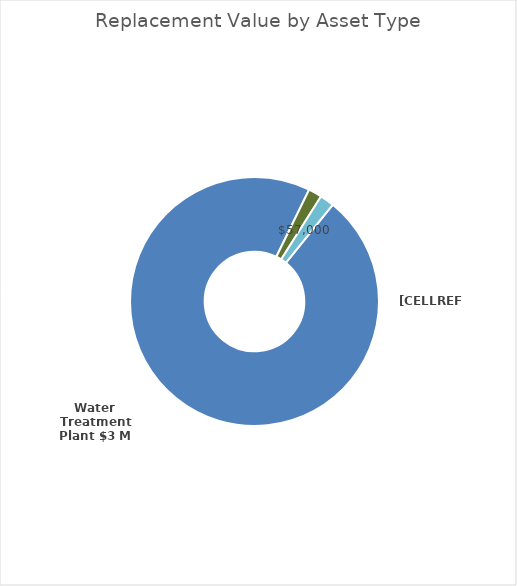
| Category | Series 1 |
|---|---|
| Water Treatment Plant | 2970000 |
| Pump Station and Reservoir  | 0 |
| Water Riser Tower (reservoir) | 0 |
| Pumphouses | 0 |
| Water Mains | 54000 |
| Portable Water Pipe | 0 |
| Hydrants | 0 |
| Valves | 0 |
| Service Connection | 57000 |
| Service Connection Valve | 0 |
| Water Trucks | 0 |